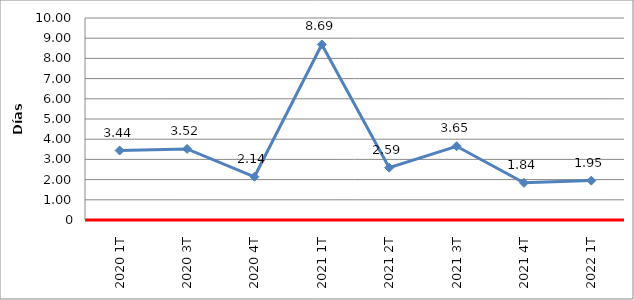
| Category | Total |
|---|---|
| 2020 1T | 3.44 |
| 2020 3T | 3.52 |
| 2020 4T | 2.14 |
| 2021 1T | 8.69 |
| 2021 2T | 2.59 |
| 2021 3T | 3.65 |
| 2021 4T | 1.84 |
| 2022 1T | 1.95 |